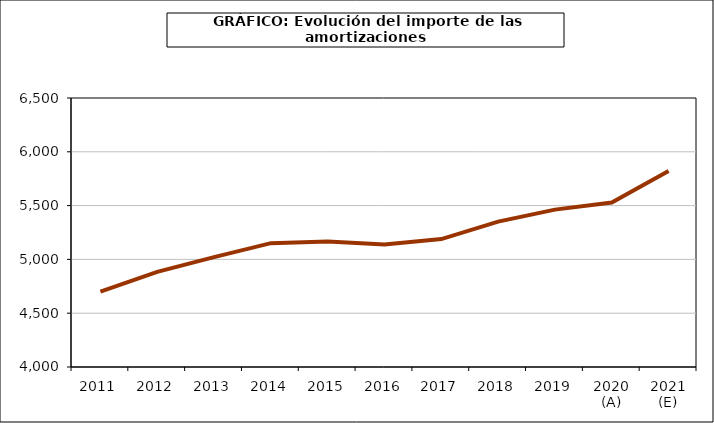
| Category | amortizacion |
|---|---|
| 2011 | 4699.859 |
| 2012 | 4884.543 |
| 2013 | 5021.523 |
| 2014 | 5151.042 |
| 2015 | 5167.348 |
| 2016 | 5137.515 |
| 2017 | 5189.174 |
| 2018 | 5351.475 |
| 2019 | 5462.515 |
| 2020 (A) | 5528.881 |
| 2021 (E) | 5821.558 |